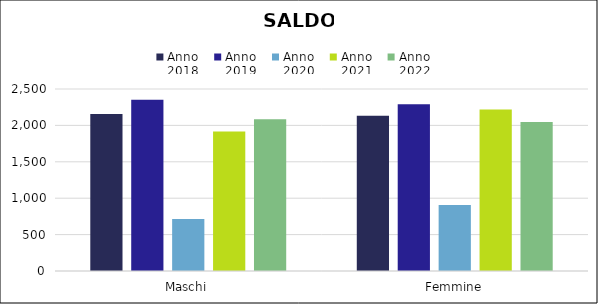
| Category | Anno
2018 | Anno
2019 | Anno
2020 | Anno
2021 | Anno
2022 |
|---|---|---|---|---|---|
| Maschi | 2156 | 2352 | 713 | 1917 | 2083 |
| Femmine | 2134 | 2291 | 906 | 2219 | 2045 |